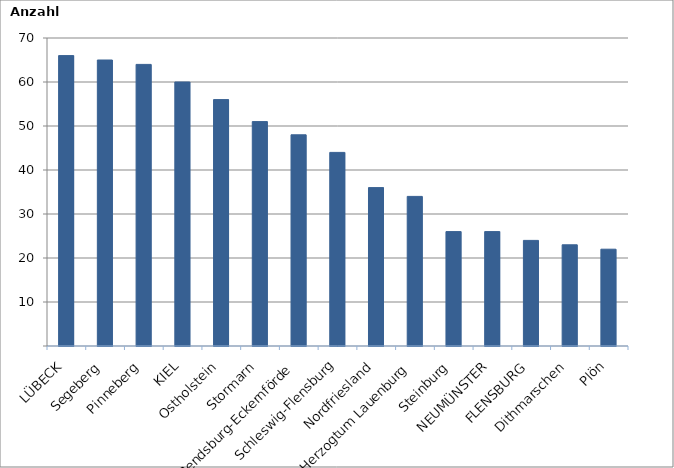
| Category | Series 0 |
|---|---|
| LÜBECK | 66 |
| Segeberg | 65 |
| Pinneberg | 64 |
| KIEL | 60 |
| Ostholstein | 56 |
| Stormarn | 51 |
| Rendsburg-Eckernförde | 48 |
| Schleswig-Flensburg | 44 |
| Nordfriesland | 36 |
| Herzogtum Lauenburg | 34 |
| Steinburg | 26 |
| NEUMÜNSTER | 26 |
| FLENSBURG | 24 |
| Dithmarschen | 23 |
| Plön | 22 |